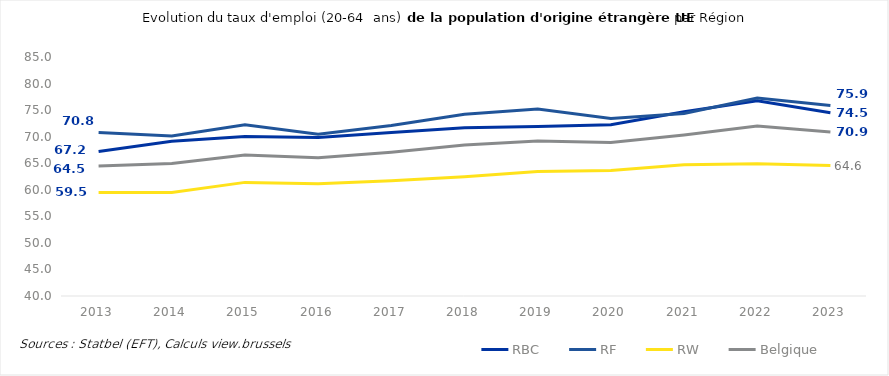
| Category | RBC | RF | RW | Belgique |
|---|---|---|---|---|
| 2013.0 | 67.227 | 70.799 | 59.492 | 64.461 |
| 2014.0 | 69.12 | 70.148 | 59.481 | 64.936 |
| 2015.0 | 70.012 | 72.238 | 61.392 | 66.525 |
| 2016.0 | 69.838 | 70.466 | 61.146 | 66.049 |
| 2017.0 | 70.776 | 72.112 | 61.702 | 67.084 |
| 2018.0 | 71.687 | 74.202 | 62.435 | 68.42 |
| 2019.0 | 71.927 | 75.193 | 63.426 | 69.194 |
| 2020.0 | 72.25 | 73.428 | 63.624 | 68.902 |
| 2021.0 | 74.693 | 74.364 | 64.69 | 70.335 |
| 2022.0 | 76.753 | 77.286 | 64.887 | 72.016 |
| 2023.0 | 74.489 | 75.863 | 64.551 | 70.888 |